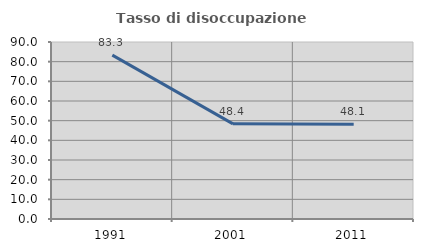
| Category | Tasso di disoccupazione giovanile  |
|---|---|
| 1991.0 | 83.333 |
| 2001.0 | 48.387 |
| 2011.0 | 48.148 |